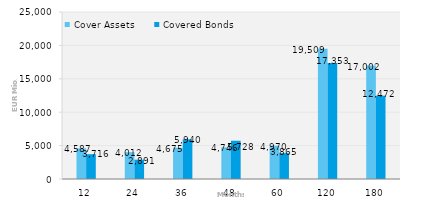
| Category | Cover Assets | Covered Bonds |
|---|---|---|
| 12.0 | 4586.962 | 3716 |
| 24.0 | 4012.329 | 2890.872 |
| 36.0 | 4674.889 | 5940.247 |
| 48.0 | 4746.35 | 5728.067 |
| 60.0 | 4970.357 | 3865.388 |
| 120.0 | 19508.876 | 17353.46 |
| 180.0 | 17002.107 | 12471.935 |